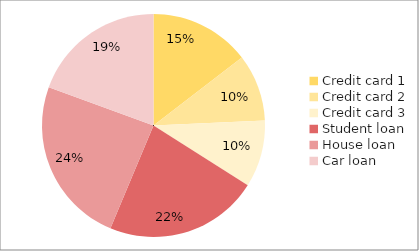
| Category | Planned |
|---|---|
| Credit card 1 | 150 |
| Credit card 2 | 100 |
| Credit card 3 | 100 |
| Student loan | 230 |
| House loan | 250 |
| Car loan | 200 |